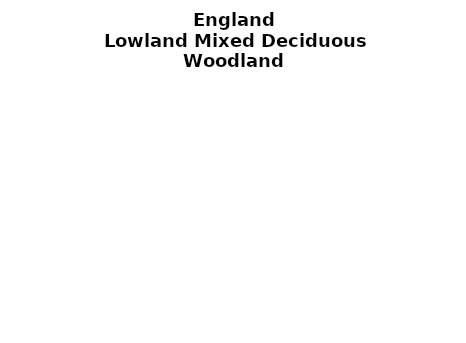
| Category | Lowland Mixed Deciduous Woodland |
|---|---|
| None | 0.036 |
| Seedlings only | 0 |
| Seedlings, saplings only | 0.028 |
| Seedlings, saplings, <7 cm trees | 0.328 |
| Saplings only | 0.096 |
| <7 cm trees, seedlings only | 0 |
| <7 cm trees, saplings only | 0.45 |
| <7 cm Trees only | 0.061 |